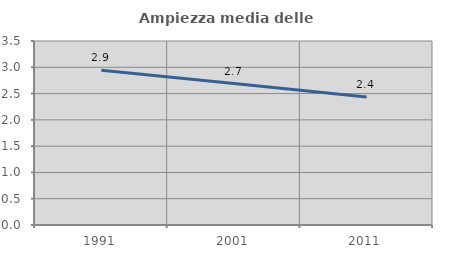
| Category | Ampiezza media delle famiglie |
|---|---|
| 1991.0 | 2.944 |
| 2001.0 | 2.691 |
| 2011.0 | 2.433 |